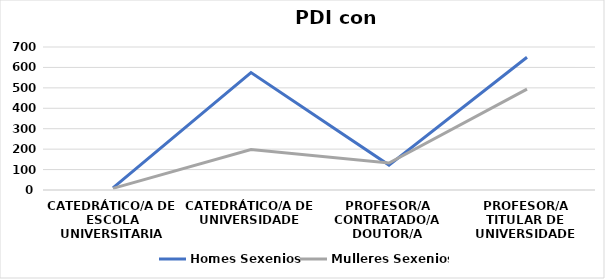
| Category | Homes | Mulleres |
|---|---|---|
| Catedrático/a de Escola Universitaria | 10 | 8 |
| Catedrático/a de Universidade | 575 | 198 |
| Profesor/a contratado/a doutor/a | 122 | 132 |
| Profesor/a titular de Universidade | 650 | 494 |